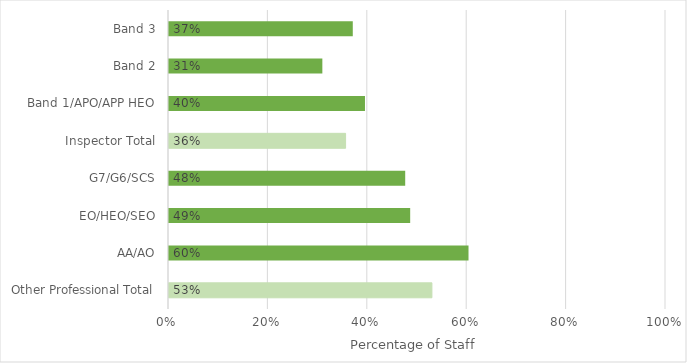
| Category | Series 0 |
|---|---|
| Other Professional Total | 0.531 |
| AA/AO | 0.605 |
| EO/HEO/SEO | 0.487 |
| G7/G6/SCS | 0.477 |
| Inspector Total | 0.357 |
| Band 1/APO/APP HEO | 0.396 |
| Band 2 | 0.311 |
| Band 3 | 0.372 |